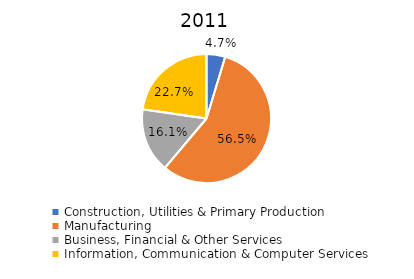
| Category | 2011 |
|---|---|
| Construction, Utilities & Primary Production  | 0.047 |
| Manufacturing  | 0.565 |
| Business, Financial & Other Services | 0.161 |
| Information, Communication & Computer Services | 0.227 |